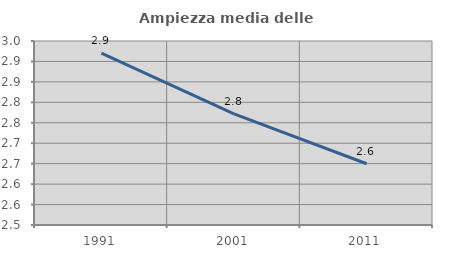
| Category | Ampiezza media delle famiglie |
|---|---|
| 1991.0 | 2.92 |
| 2001.0 | 2.772 |
| 2011.0 | 2.65 |